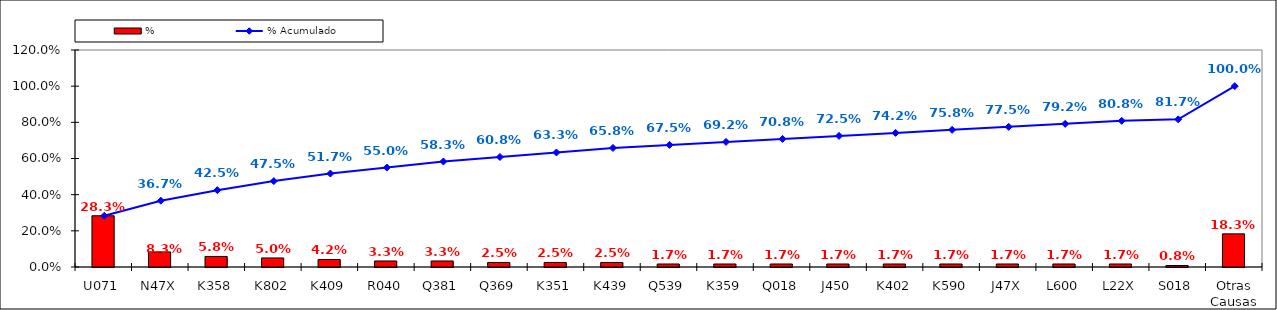
| Category | % |
|---|---|
| U071 | 0.283 |
| N47X | 0.083 |
| K358 | 0.058 |
| K802 | 0.05 |
| K409 | 0.042 |
| R040 | 0.033 |
| Q381 | 0.033 |
| Q369 | 0.025 |
| K351 | 0.025 |
| K439 | 0.025 |
| Q539 | 0.017 |
| K359 | 0.017 |
| Q018 | 0.017 |
| J450 | 0.017 |
| K402 | 0.017 |
| K590 | 0.017 |
| J47X | 0.017 |
| L600 | 0.017 |
| L22X | 0.017 |
| S018 | 0.008 |
| Otras Causas | 0.183 |